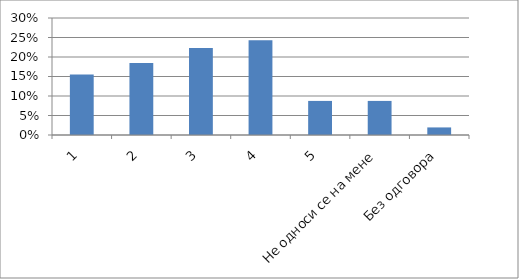
| Category | Series 0 |
|---|---|
| 1 | 0.155 |
| 2 | 0.184 |
| 3 | 0.223 |
| 4 | 0.243 |
| 5 | 0.087 |
| Не односи се на мене | 0.087 |
| Без одговора | 0.019 |